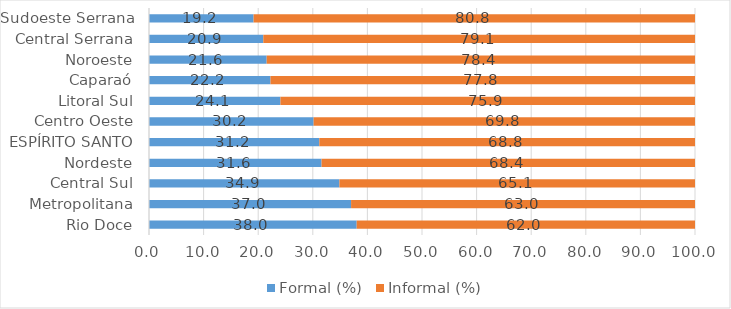
| Category | Formal (%) | Informal (%) |
|---|---|---|
| Rio Doce | 38.039 | 61.961 |
| Metropolitana | 37.011 | 62.989 |
| Central Sul | 34.874 | 65.126 |
| Nordeste | 31.606 | 68.394 |
| ESPÍRITO SANTO | 31.192 | 68.808 |
| Centro Oeste | 30.154 | 69.846 |
| Litoral Sul | 24.071 | 75.929 |
| Caparaó | 22.25 | 77.75 |
| Noroeste | 21.554 | 78.446 |
| Central Serrana | 20.933 | 79.067 |
| Sudoeste Serrana | 19.153 | 80.847 |